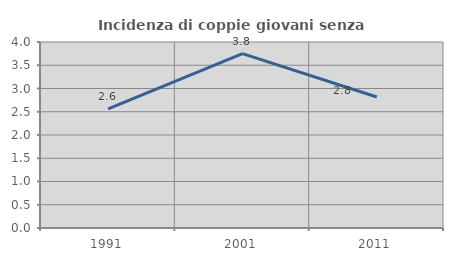
| Category | Incidenza di coppie giovani senza figli |
|---|---|
| 1991.0 | 2.564 |
| 2001.0 | 3.75 |
| 2011.0 | 2.817 |